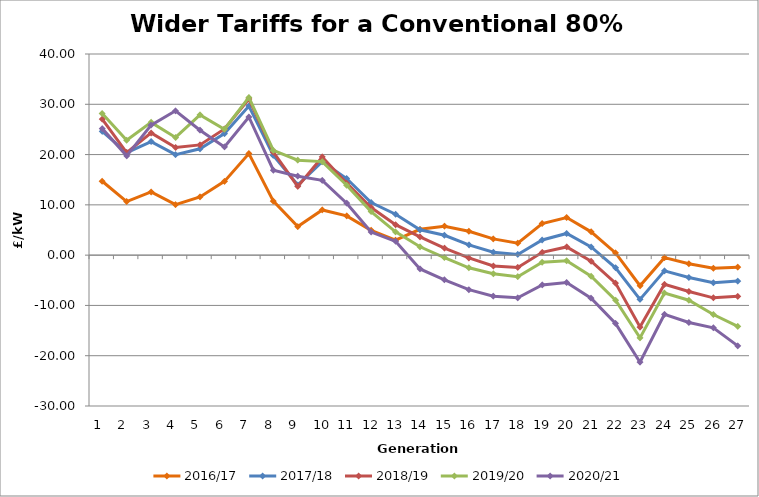
| Category | 2016/17 | 2017/18 | 2018/19 | 2019/20 | 2020/21 |
|---|---|---|---|---|---|
| 1.0 | 14.696 | 24.62 | 27.034 | 28.171 | 25.177 |
| 2.0 | 10.651 | 20.384 | 20.398 | 22.85 | 19.748 |
| 3.0 | 12.573 | 22.587 | 24.311 | 26.406 | 25.855 |
| 4.0 | 10.035 | 19.976 | 21.407 | 23.4 | 28.699 |
| 5.0 | 11.574 | 21.146 | 21.92 | 27.885 | 24.847 |
| 6.0 | 14.669 | 24.178 | 25.087 | 25.044 | 21.518 |
| 7.0 | 20.198 | 29.644 | 31.056 | 31.362 | 27.472 |
| 8.0 | 10.737 | 19.842 | 20.494 | 20.842 | 16.886 |
| 9.0 | 5.682 | 13.944 | 13.657 | 18.887 | 15.696 |
| 10.0 | 8.992 | 18.578 | 19.526 | 18.601 | 14.871 |
| 11.0 | 7.804 | 15.234 | 14.312 | 13.901 | 10.337 |
| 12.0 | 4.934 | 10.453 | 9.463 | 8.664 | 4.584 |
| 13.0 | 2.981 | 8.13 | 6.051 | 4.626 | 2.754 |
| 14.0 | 5.136 | 5.036 | 3.639 | 1.664 | -2.747 |
| 15.0 | 5.763 | 3.954 | 1.397 | -0.475 | -4.903 |
| 16.0 | 4.754 | 2.04 | -0.552 | -2.514 | -6.867 |
| 17.0 | 3.228 | 0.57 | -2.166 | -3.713 | -8.155 |
| 18.0 | 2.379 | 0.135 | -2.444 | -4.286 | -8.492 |
| 19.0 | 6.291 | 3.013 | 0.567 | -1.411 | -5.931 |
| 20.0 | 7.478 | 4.315 | 1.636 | -1.099 | -5.451 |
| 21.0 | 4.632 | 1.627 | -1.207 | -4.201 | -8.55 |
| 22.0 | 0.442 | -2.518 | -5.565 | -8.973 | -13.567 |
| 23.0 | -6.087 | -8.793 | -14.296 | -16.454 | -21.296 |
| 24.0 | -0.502 | -3.129 | -5.813 | -7.526 | -11.771 |
| 25.0 | -1.697 | -4.458 | -7.233 | -8.965 | -13.4 |
| 26.0 | -2.622 | -5.489 | -8.489 | -11.804 | -14.45 |
| 27.0 | -2.399 | -5.156 | -8.19 | -14.178 | -18.043 |